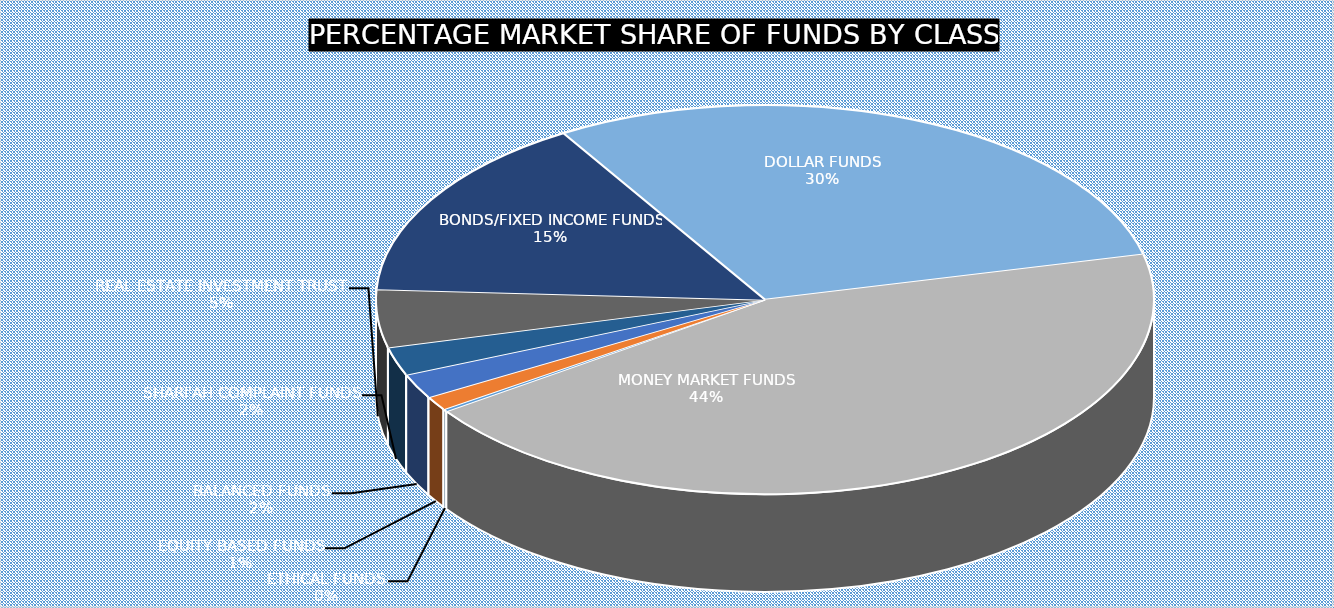
| Category | 29-Sep |
|---|---|
| ETHICAL FUNDS | 3871825099.96 |
| EQUITY BASED FUNDS | 22347298706.34 |
| BALANCED FUNDS | 39835802330.054 |
| SHARI'AH COMPLAINT FUNDS | 45697413516.34 |
| REAL ESTATE INVESTMENT TRUST | 92953013524.98 |
| BONDS/FIXED INCOME FUNDS | 300146733726.062 |
| DOLLAR FUNDS | 580580020013.899 |
| MONEY MARKET FUNDS | 852624898169.65 |